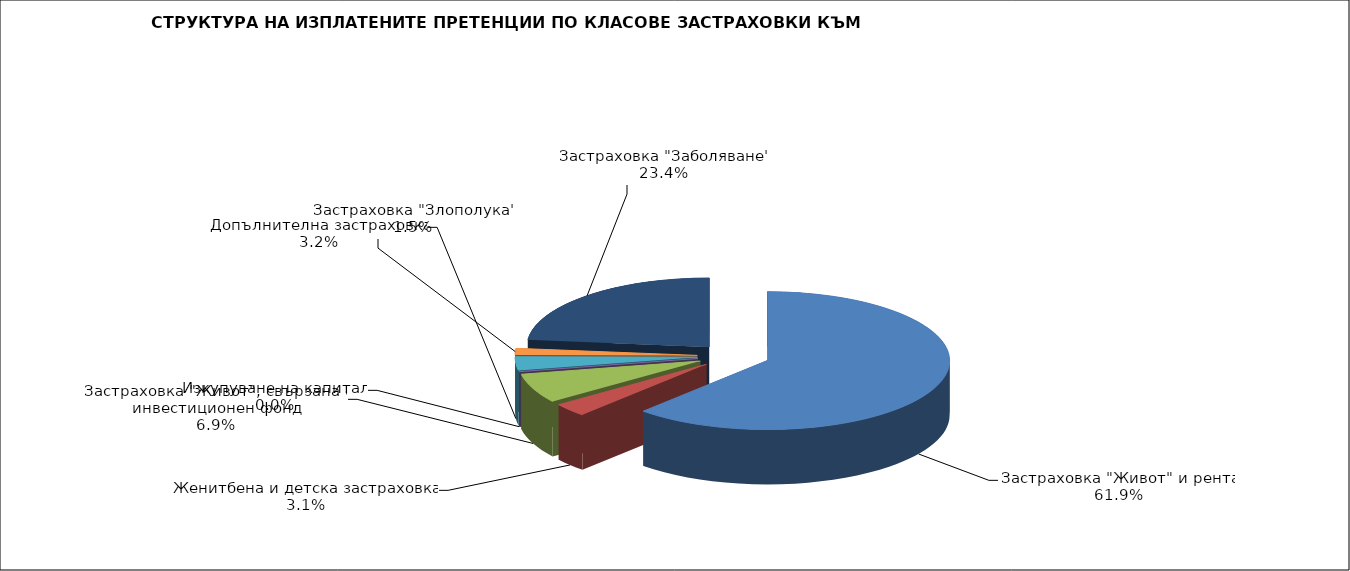
| Category | 94 083 206 |
|---|---|
| Застраховка "Живот" и рента | 94083206.24 |
| Женитбена и детска застраховка | 4753961.733 |
| Застраховка "Живот", свързана с инвестиционен фонд | 10494232.335 |
| Изкупуване на капитал | 0 |
| Допълнителна застраховка | 4851725.47 |
| Застраховка "Злополука" | 2310880.313 |
| Застраховка "Заболяване" | 35518742.406 |